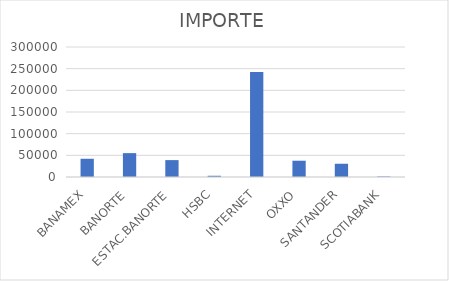
| Category | IMPORTE |
|---|---|
| BANAMEX | 42060.18 |
| BANORTE | 55083.68 |
| ESTAC.BANORTE | 38979.5 |
| HSBC | 2848.85 |
| INTERNET | 242099.31 |
| OXXO | 37552.9 |
| SANTANDER | 30567.28 |
| SCOTIABANK | 1212.44 |